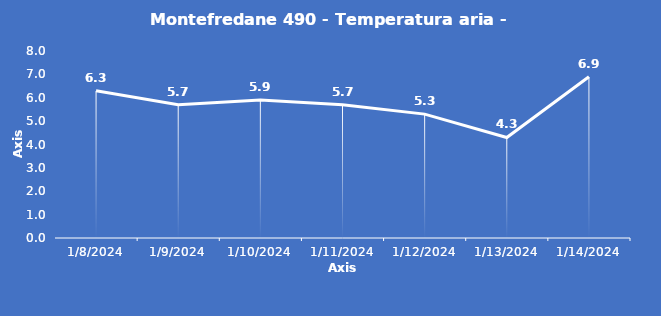
| Category | Montefredane 490 - Temperatura aria - Grezzo (°C) |
|---|---|
| 1/8/24 | 6.3 |
| 1/9/24 | 5.7 |
| 1/10/24 | 5.9 |
| 1/11/24 | 5.7 |
| 1/12/24 | 5.3 |
| 1/13/24 | 4.3 |
| 1/14/24 | 6.9 |